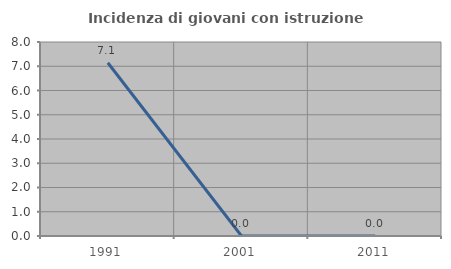
| Category | Incidenza di giovani con istruzione universitaria |
|---|---|
| 1991.0 | 7.143 |
| 2001.0 | 0 |
| 2011.0 | 0 |